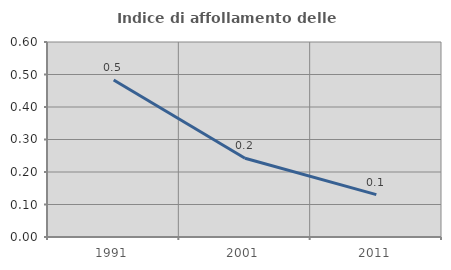
| Category | Indice di affollamento delle abitazioni  |
|---|---|
| 1991.0 | 0.483 |
| 2001.0 | 0.242 |
| 2011.0 | 0.13 |